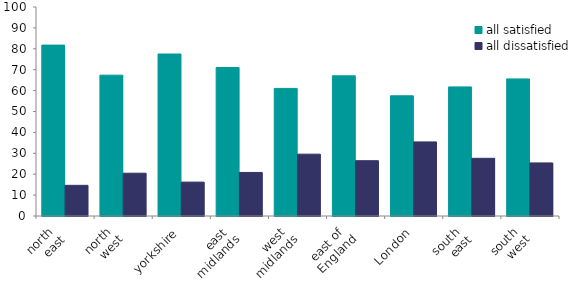
| Category | all satisfied | all dissatisfied |
|---|---|---|
| north 
east | 81.761 | 14.675 |
| north 
west | 67.378 | 20.481 |
| yorkshire | 77.506 | 16.21 |
| east 
midlands | 71.06 | 20.829 |
| west 
midlands | 61.048 | 29.588 |
| east of 
England | 67.066 | 26.462 |
| London | 57.506 | 35.449 |
| south 
east | 61.766 | 27.607 |
| south 
west | 65.581 | 25.401 |